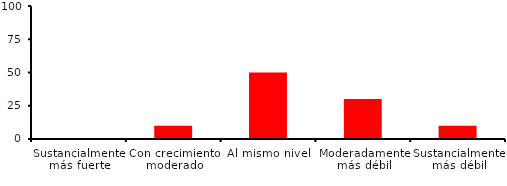
| Category | Series 0 |
|---|---|
| Sustancialmente más fuerte | 0 |
| Con crecimiento moderado | 10 |
| Al mismo nivel | 50 |
| Moderadamente más débil | 30 |
| Sustancialmente más débil | 10 |